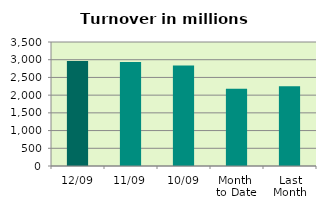
| Category | Series 0 |
|---|---|
| 12/09 | 2963.396 |
| 11/09 | 2935.022 |
| 10/09 | 2834.605 |
| Month 
to Date | 2179.418 |
| Last
Month | 2251.437 |